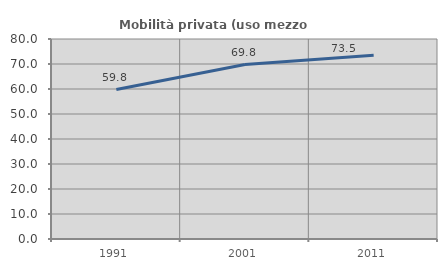
| Category | Mobilità privata (uso mezzo privato) |
|---|---|
| 1991.0 | 59.782 |
| 2001.0 | 69.782 |
| 2011.0 | 73.461 |